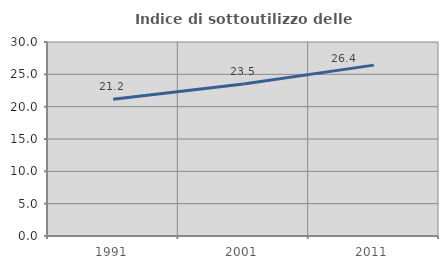
| Category | Indice di sottoutilizzo delle abitazioni  |
|---|---|
| 1991.0 | 21.152 |
| 2001.0 | 23.507 |
| 2011.0 | 26.422 |